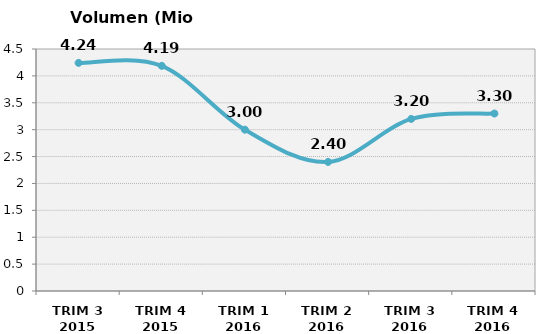
| Category | Volumen (Mio consumiciones) |
|---|---|
| TRIM 3 2015 | 4.242 |
| TRIM 4 2015 | 4.187 |
| TRIM 1 2016 | 3 |
| TRIM 2 2016 | 2.4 |
| TRIM 3 2016 | 3.2 |
| TRIM 4 2016 | 3.3 |